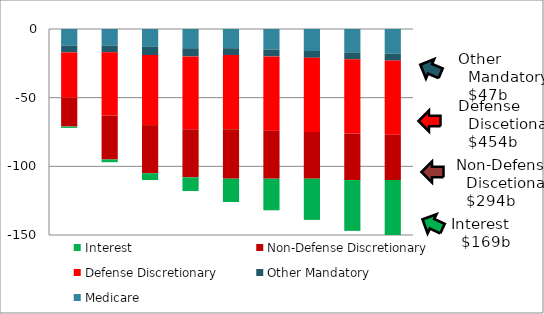
| Category | Medicare | Other Mandatory | Defense Discretionary | Non-Defense Discretionary | Interest |
|---|---|---|---|---|---|
| 2013.0 | -12 | -5 | -33 | -21 | -1 |
| 2014.0 | -12 | -5 | -46 | -32 | -2 |
| 2015.0 | -13 | -6 | -51 | -35 | -5 |
| 2016.0 | -14 | -6 | -53 | -35 | -10 |
| 2017.0 | -14 | -5 | -54 | -36 | -17 |
| 2018.0 | -15 | -5 | -54 | -35 | -23 |
| 2019.0 | -16 | -5 | -54 | -34 | -30 |
| 2020.0 | -17 | -5 | -54 | -34 | -37 |
| 2021.0 | -18 | -5 | -54 | -33 | -44 |